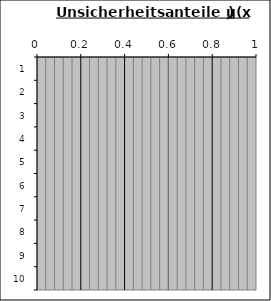
| Category | Unsicherheitsanteile |
|---|---|
| 0 | 0 |
| 1 | 0 |
| 2 | 0 |
| 3 | 0 |
| 4 | 0 |
| 5 | 0 |
| 6 | 0 |
| 7 | 0 |
| 8 | 0 |
| 9 | 0 |